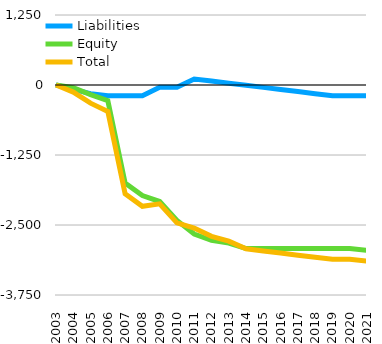
| Category | Liabilities  | Equity  | Total |
|---|---|---|---|
| 2003 | 0 | 0 | 0 |
| 2004 | -76.925 | -49.297 | -126.222 |
| 2005 | -153.85 | -170.53 | -324.38 |
| 2006 | -192.3 | -280.388 | -472.688 |
| 2007 | -192.3 | -1748.763 | -1941.063 |
| 2008 | -192.3 | -1973.893 | -2166.193 |
| 2009 | -42.3 | -2080.805 | -2123.105 |
| 2010 | -42.3 | -2419.134 | -2461.434 |
| 2011 | 107.7 | -2661.74 | -2554.04 |
| 2012 | 70.2 | -2772.2 | -2702 |
| 2013 | 32.7 | -2821.514 | -2788.814 |
| 2014 | -4.8 | -2921.066 | -2925.866 |
| 2015 | -42.3 | -2921.102 | -2963.402 |
| 2016 | -79.8 | -2921.11 | -3000.91 |
| 2017 | -117.3 | -2921.11 | -3038.41 |
| 2018 | -154.8 | -2921.11 | -3075.91 |
| 2019 | -192.3 | -2921.11 | -3113.41 |
| 2020 | -192.3 | -2921.11 | -3113.41 |
| 2021 | -192.3 | -2954.21 | -3146.51 |